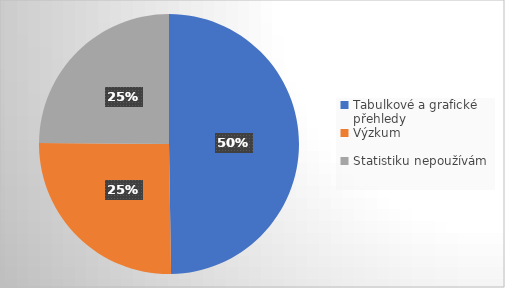
| Category | Series 0 |
|---|---|
| Tabulkové a grafické přehledy | 98 |
| Výzkum | 50 |
| Statistiku nepoužívám | 49 |